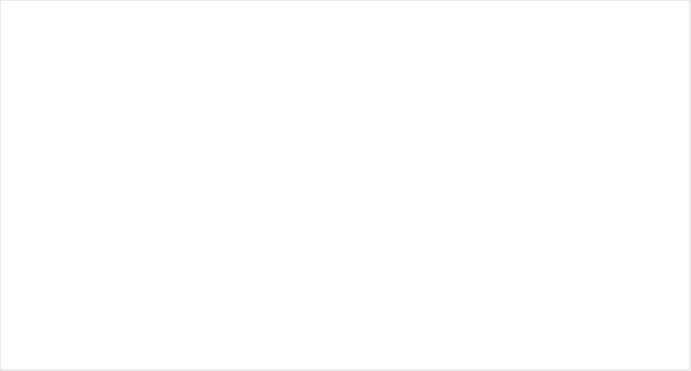
| Category | Total |
|---|---|
| Boston | 1058 |
| Central | 1093 |
| Metro West | 1150 |
| Northeast | 869 |
| Southeast | 1400 |
| Western | 1120 |